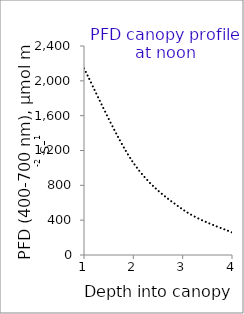
| Category | Series 2 |
|---|---|
| 1.0 | 2143.345 |
| 2.0 | 1059.29 |
| 3.0 | 523.525 |
| 4.0 | 258.738 |